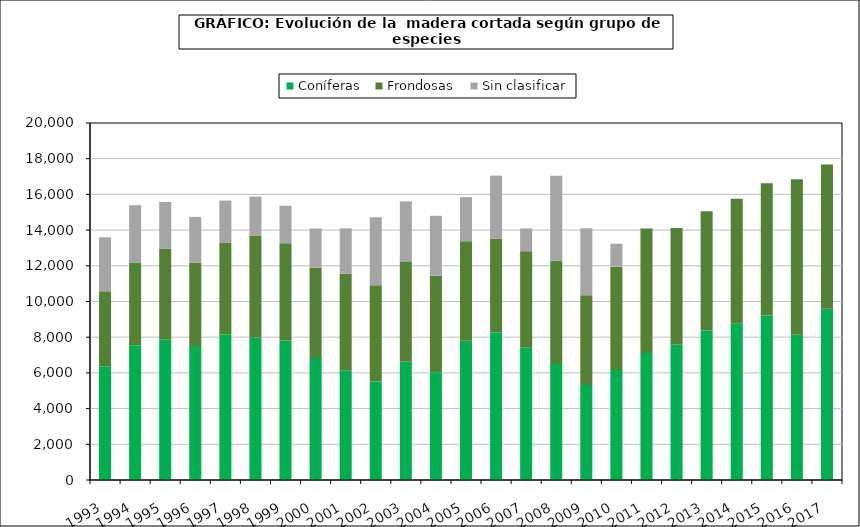
| Category | Coníferas | Frondosas | Sin clasificar |
|---|---|---|---|
| 1993.0 | 6372 | 4197 | 3027 |
| 1994.0 | 7549 | 4601 | 3244 |
| 1995.0 | 7882 | 5068 | 2623 |
| 1996.0 | 7507 | 4662 | 2571 |
| 1997.0 | 8160 | 5116 | 2378 |
| 1998.0 | 7981 | 5710 | 2183 |
| 1999.0 | 7816 | 5447 | 2099 |
| 2000.0 | 6838 | 5058 | 2193 |
| 2001.0 | 6148 | 5407 | 2546 |
| 2002.0 | 5525 | 5382 | 3806 |
| 2003.0 | 6631 | 5582 | 3396 |
| 2004.0 | 6037 | 5409 | 3353 |
| 2005.0 | 7804 | 5578 | 2466 |
| 2006.0 | 8270 | 5260 | 3523 |
| 2007.0 | 7406 | 5408 | 1281 |
| 2008.0 | 6501 | 5788 | 4761 |
| 2009.0 | 5318 | 5038 | 3754.288 |
| 2010.0 | 6163.941 | 5787.672 | 1287.882 |
| 2011.0 | 7115.03 | 6977.661 | 0 |
| 2012.0 | 7598.388 | 6520.861 | 0 |
| 2013.0 | 8378.464 | 6681.31 | 0 |
| 2014.0 | 8779.452 | 6982.438 | 0 |
| 2015.0 | 9218.396 | 7411.416 | 0 |
| 2016.0 | 8134.565 | 8713.252 | 0 |
| 2017.0 | 9589.022 | 8091.004 | 0 |